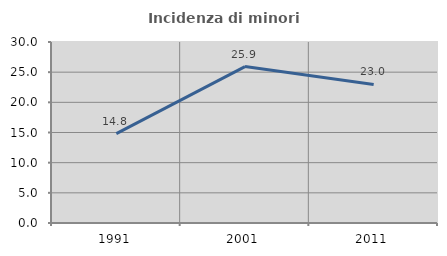
| Category | Incidenza di minori stranieri |
|---|---|
| 1991.0 | 14.815 |
| 2001.0 | 25.926 |
| 2011.0 | 22.967 |